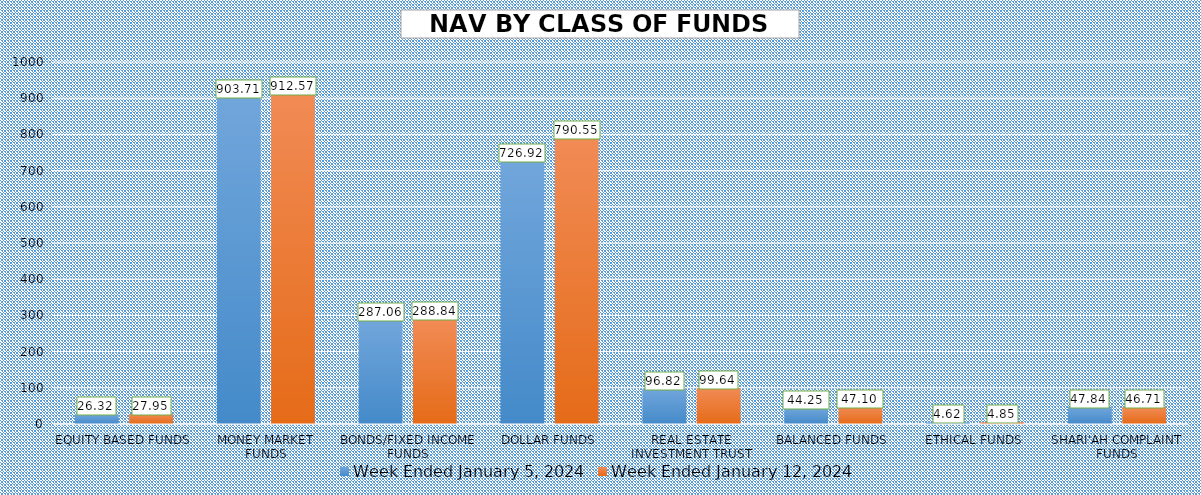
| Category | Week Ended January 5, 2024 | Week Ended January 12, 2024 |
|---|---|---|
| EQUITY BASED FUNDS | 26.318 | 27.951 |
| MONEY MARKET FUNDS | 903.708 | 912.572 |
| BONDS/FIXED INCOME FUNDS | 287.055 | 288.836 |
| DOLLAR FUNDS | 726.921 | 790.548 |
| REAL ESTATE INVESTMENT TRUST | 96.816 | 99.637 |
| BALANCED FUNDS | 44.249 | 47.103 |
| ETHICAL FUNDS | 4.62 | 4.848 |
| SHARI'AH COMPLAINT FUNDS | 47.838 | 46.709 |